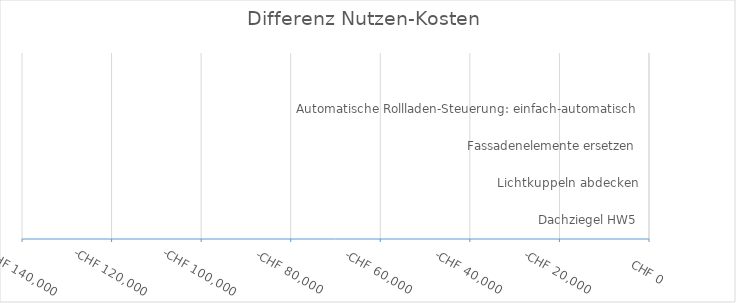
| Category | Differenz Nutzen-Kosten |
|---|---|
| Dachziegel HW5 |  |
| Lichtkuppeln abdecken |  |
| Fassadenelemente ersetzen |  |
| Automatische Rollladen-Steuerung: einfach-automatisch |  |